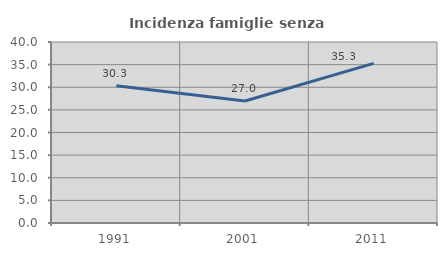
| Category | Incidenza famiglie senza nuclei |
|---|---|
| 1991.0 | 30.327 |
| 2001.0 | 26.956 |
| 2011.0 | 35.288 |